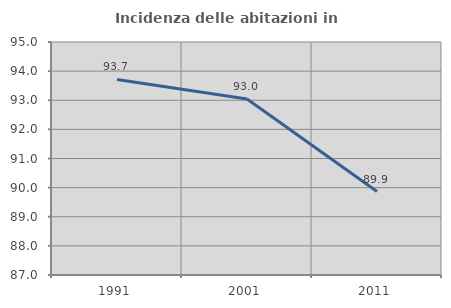
| Category | Incidenza delle abitazioni in proprietà  |
|---|---|
| 1991.0 | 93.715 |
| 2001.0 | 93.042 |
| 2011.0 | 89.865 |